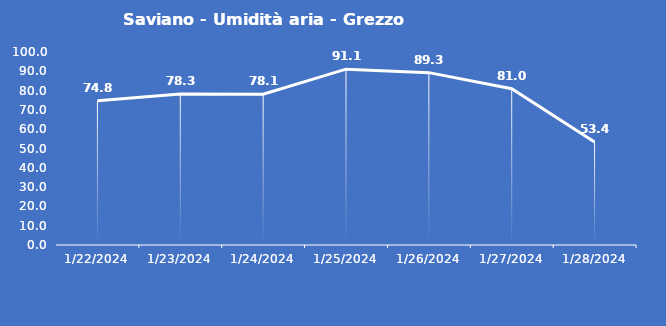
| Category | Saviano - Umidità aria - Grezzo (%) |
|---|---|
| 1/22/24 | 74.8 |
| 1/23/24 | 78.3 |
| 1/24/24 | 78.1 |
| 1/25/24 | 91.1 |
| 1/26/24 | 89.3 |
| 1/27/24 | 81 |
| 1/28/24 | 53.4 |